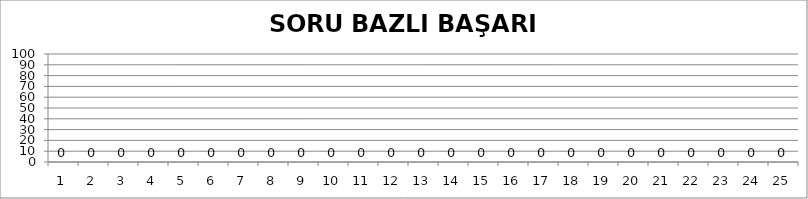
| Category | Series 1 |
|---|---|
| 0 | 0 |
| 1 | 0 |
| 2 | 0 |
| 3 | 0 |
| 4 | 0 |
| 5 | 0 |
| 6 | 0 |
| 7 | 0 |
| 8 | 0 |
| 9 | 0 |
| 10 | 0 |
| 11 | 0 |
| 12 | 0 |
| 13 | 0 |
| 14 | 0 |
| 15 | 0 |
| 16 | 0 |
| 17 | 0 |
| 18 | 0 |
| 19 | 0 |
| 20 | 0 |
| 21 | 0 |
| 22 | 0 |
| 23 | 0 |
| 24 | 0 |